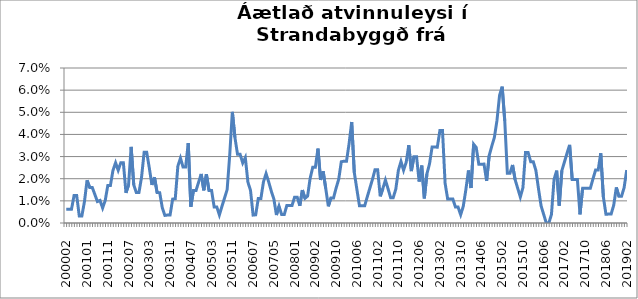
| Category | Series 0 |
|---|---|
| 200002 | 0.006 |
| 200003 | 0.006 |
| 200004 | 0.006 |
| 200005 | 0.012 |
| 200006 | 0.012 |
| 200007 | 0.003 |
| 200011 | 0.003 |
| 200012 | 0.01 |
| 200101 | 0.019 |
| 200103 | 0.016 |
| 200104 | 0.016 |
| 200105 | 0.013 |
| 200106 | 0.01 |
| 200107 | 0.01 |
| 200108 | 0.007 |
| 200110 | 0.01 |
| 200111 | 0.017 |
| 200112 | 0.017 |
| 200201 | 0.024 |
| 200202 | 0.027 |
| 200203 | 0.024 |
| 200204 | 0.027 |
| 200205 | 0.027 |
| 200206 | 0.014 |
| 200207 | 0.017 |
| 200208 | 0.034 |
| 200209 | 0.017 |
| 200210 | 0.014 |
| 200211 | 0.014 |
| 200212 | 0.021 |
| 200301 | 0.032 |
| 200302 | 0.032 |
| 200303 | 0.025 |
| 200304 | 0.017 |
| 200305 | 0.021 |
| 200306 | 0.014 |
| 200307 | 0.014 |
| 200308 | 0.007 |
| 200309 | 0.003 |
| 200310 | 0.004 |
| 200311 | 0.004 |
| 200312 | 0.011 |
| 200401 | 0.011 |
| 200402 | 0.026 |
| 200403 | 0.029 |
| 200404 | 0.025 |
| 200405 | 0.025 |
| 200406 | 0.036 |
| 200407 | 0.007 |
| 200408 | 0.015 |
| 200409 | 0.015 |
| 200410 | 0.018 |
| 200411 | 0.022 |
| 200412 | 0.015 |
| 200501 | 0.022 |
| 200502 | 0.015 |
| 200503 | 0.015 |
| 200504 | 0.007 |
| 200505 | 0.007 |
| 200506 | 0.004 |
| 200507 | 0.008 |
| 200508 | 0.011 |
| 200509 | 0.015 |
| 200510 | 0.031 |
| 200511 | 0.05 |
| 200512 | 0.039 |
| 200601 | 0.031 |
| 200602 | 0.031 |
| 200603 | 0.027 |
| 200604 | 0.03 |
| 200605 | 0.018 |
| 200606 | 0.015 |
| 200607 | 0.004 |
| 200610 | 0.004 |
| 200611 | 0.011 |
| 200612 | 0.011 |
| 200701 | 0.019 |
| 200702 | 0.022 |
| 200703 | 0.019 |
| 200704 | 0.014 |
| 200705 | 0.011 |
| 200706 | 0.004 |
| 200707 | 0.008 |
| 200708 | 0.004 |
| 200709 | 0.004 |
| 200710 | 0.008 |
| 200711 | 0.008 |
| 200712 | 0.008 |
| 200801 | 0.012 |
| 200802 | 0.012 |
| 200803 | 0.008 |
| 200804 | 0.015 |
| 200805 | 0.011 |
| 200811 | 0.012 |
| 200812 | 0.02 |
| 200901 | 0.025 |
| 200902 | 0.025 |
| 200903 | 0.034 |
| 200904 | 0.019 |
| 200905 | 0.023 |
| 200906 | 0.016 |
| 200907 | 0.008 |
| 200908 | 0.011 |
| 200909 | 0.011 |
| 200910 | 0.016 |
| 200911 | 0.02 |
| 200912 | 0.028 |
| 201001 | 0.028 |
| 201002 | 0.028 |
| 201003 | 0.036 |
| 201004 | 0.046 |
| 201005 | 0.023 |
| 201006 | 0.015 |
| 201007 | 0.008 |
| 201008 | 0.008 |
| 201009 | 0.008 |
| 201010 | 0.012 |
| 201011 | 0.016 |
| 201012 | 0.02 |
| 201101 | 0.024 |
| 201102 | 0.024 |
| 201103 | 0.012 |
| 201104 | 0.016 |
| 201105 | 0.019 |
| 201106 | 0.016 |
| 201107 | 0.011 |
| 201108 | 0.011 |
| 201109 | 0.015 |
| 201110 | 0.024 |
| 201111 | 0.028 |
| 201112 | 0.024 |
| 201201 | 0.027 |
| 201202 | 0.035 |
| 201203 | 0.023 |
| 201204 | 0.03 |
| 201205 | 0.03 |
| 201206 | 0.019 |
| 201207 | 0.026 |
| 201208 | 0.011 |
| 201209 | 0.022 |
| 201210 | 0.027 |
| 201211 | 0.034 |
| 201212 | 0.034 |
| 201301 | 0.034 |
| 201302 | 0.042 |
| 201303 | 0.042 |
| 201304 | 0.018 |
| 201305 | 0.011 |
| 201306 | 0.011 |
| 201307 | 0.011 |
| 201308 | 0.007 |
| 201309 | 0.007 |
| 201310 | 0.004 |
| 201311 | 0.007 |
| 201312 | 0.015 |
| 201401 | 0.024 |
| 201402 | 0.016 |
| 201403 | 0.036 |
| 201404 | 0.034 |
| 201405 | 0.027 |
| 201406 | 0.027 |
| 201407 | 0.027 |
| 201408 | 0.019 |
| 201409 | 0.03 |
| 201410 | 0.035 |
| 201411 | 0.039 |
| 201412 | 0.046 |
| 201501 | 0.058 |
| 201502 | 0.062 |
| 201503 | 0.046 |
| 201504 | 0.022 |
| 201505 | 0.022 |
| 201506 | 0.026 |
| 201507 | 0.02 |
| 201508 | 0.016 |
| 201509 | 0.012 |
| 201510 | 0.016 |
| 201511 | 0.032 |
| 201512 | 0.032 |
| 201601 | 0.028 |
| 201602 | 0.028 |
| 201603 | 0.024 |
| 201604 | 0.016 |
| 201605 | 0.008 |
| 201606 | 0.004 |
| 201607 | 0 |
| 201608 | 0 |
| 201609 | 0.004 |
| 201610 | 0.02 |
| 201611 | 0.024 |
| 201612 | 0.008 |
| 201701 | 0.024 |
| 201702 | 0.028 |
| 201703 | 0.031 |
| 201704 | 0.035 |
| 201705 | 0.02 |
| 201706 | 0.02 |
| 201707 | 0.02 |
| 201708 | 0.004 |
| 201709 | 0.016 |
| 201710 | 0.016 |
| 201711 | 0.016 |
| 201712 | 0.016 |
| 201801 | 0.02 |
| 201802 | 0.024 |
| 201803 | 0.024 |
| 201804 | 0.031 |
| 201805 | 0.012 |
| 201806 | 0.004 |
| 201807 | 0.004 |
| 201808 | 0.004 |
| 201809 | 0.008 |
| 201810 | 0.016 |
| 201811 | 0.012 |
| 201812 | 0.012 |
| 201901 | 0.016 |
| 201902 | 0.024 |